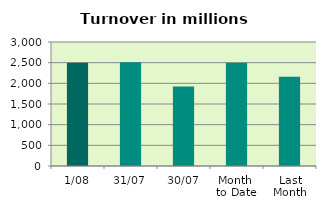
| Category | Series 0 |
|---|---|
| 1/08 | 2498.126 |
| 31/07 | 2512.728 |
| 30/07 | 1926.054 |
| Month 
to Date | 2498.126 |
| Last
Month | 2159.874 |